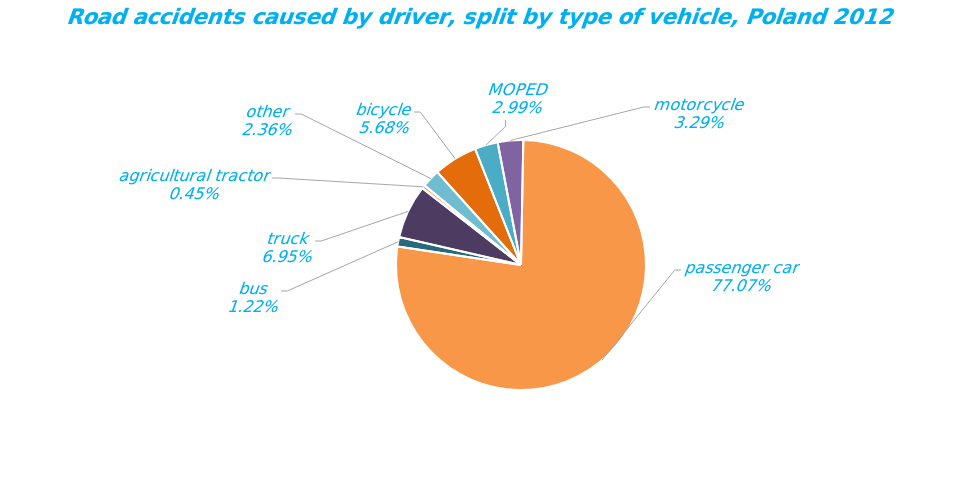
| Category | Series 0 |
|---|---|
| bicycle | 1714 |
| MOPED | 903 |
| motorcycle | 994 |
| passenger car | 23265 |
| bus | 367 |
| truck | 2096 |
| agricultural tractor | 136 |
| other | 711 |